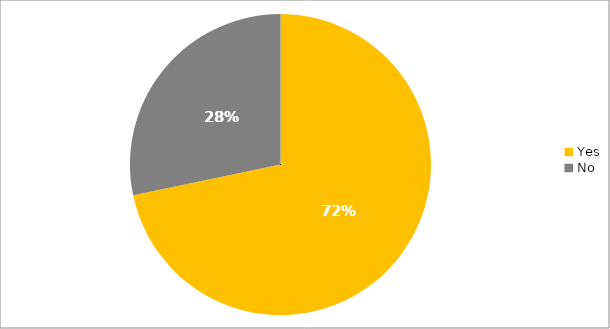
| Category | Responses |
|---|---|
| Yes | 0.717 |
| No | 0.283 |